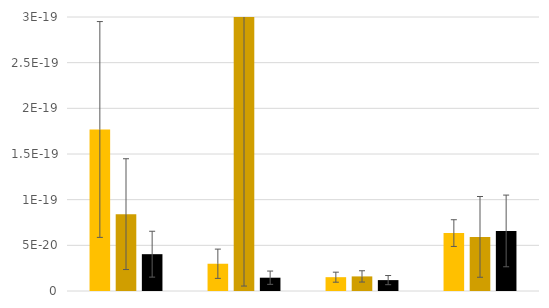
| Category | Series 0 | Series 1 | Series 2 |
|---|---|---|---|
| 0 | 0 | 0 | 0 |
| 1 | 0 | 0 | 0 |
| 2 | 0 | 0 | 0 |
| 3 | 0 | 0 | 0 |